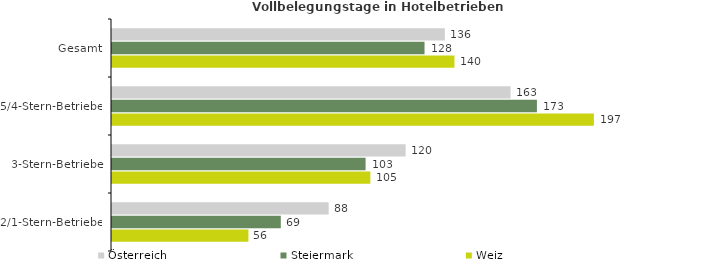
| Category | Österreich | Steiermark | Weiz |
|---|---|---|---|
| Gesamt | 135.866 | 127.561 | 139.775 |
| 5/4-Stern-Betriebe | 162.683 | 173.435 | 196.683 |
| 3-Stern-Betriebe | 119.851 | 103.499 | 105.445 |
| 2/1-Stern-Betriebe | 88.435 | 68.894 | 55.679 |